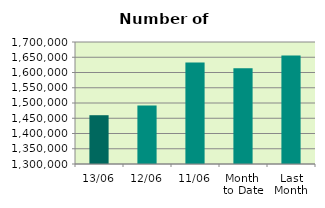
| Category | Series 0 |
|---|---|
| 13/06 | 1459952 |
| 12/06 | 1492058 |
| 11/06 | 1632918 |
| Month 
to Date | 1613918.889 |
| Last
Month | 1656073.545 |